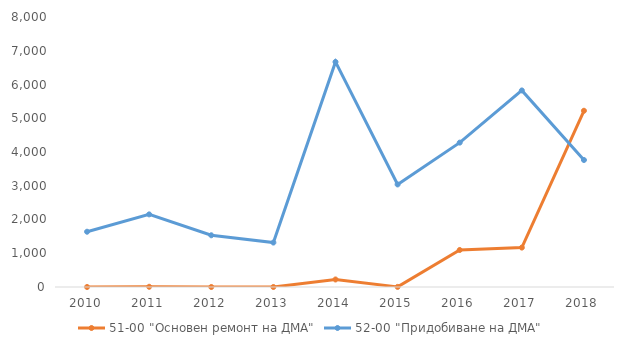
| Category | 51-00 "Основен ремонт на ДМА" | 52-00 "Придобиване на ДМА" |
|---|---|---|
| 2010.0 | 0 | 1637.797 |
| 2011.0 | 6.629 | 2151.948 |
| 2012.0 | 0 | 1532.522 |
| 2013.0 | 0 | 1316.695 |
| 2014.0 | 223.127 | 6669.296 |
| 2015.0 | 3.019 | 3038.642 |
| 2016.0 | 1096.465 | 4277.889 |
| 2017.0 | 1167.713 | 5824.036 |
| 2018.0 | 5222 | 3762.714 |